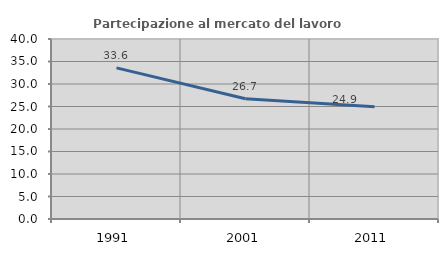
| Category | Partecipazione al mercato del lavoro  femminile |
|---|---|
| 1991.0 | 33.581 |
| 2001.0 | 26.73 |
| 2011.0 | 24.94 |